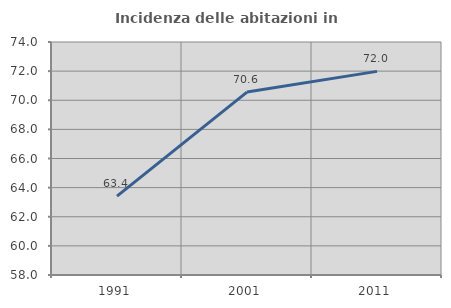
| Category | Incidenza delle abitazioni in proprietà  |
|---|---|
| 1991.0 | 63.422 |
| 2001.0 | 70.561 |
| 2011.0 | 71.983 |